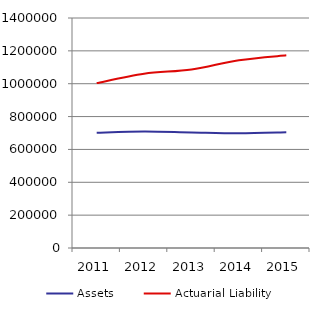
| Category |  Assets  |  Actuarial Liability  |
|---|---|---|
| 2011.0 | 701518 | 1003854 |
| 2012.0 | 709642 | 1060648 |
| 2013.0 | 703559 | 1086732 |
| 2014.0 | 698585 | 1143227 |
| 2015.0 | 704531 | 1172930 |